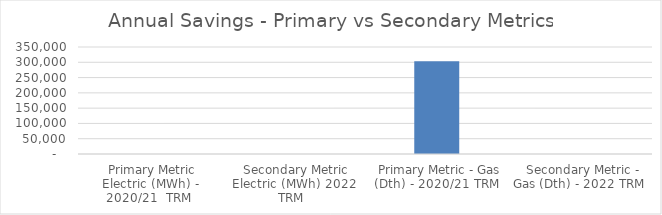
| Category | Series 0 |
|---|---|
|  Primary Metric Electric (MWh) - 2020/21  TRM  | 0 |
|  Secondary Metric Electric (MWh) 2022 TRM  | 0 |
|  Primary Metric - Gas (Dth) - 2020/21 TRM  | 302990.549 |
|  Secondary Metric - Gas (Dth) - 2022 TRM  | 0 |